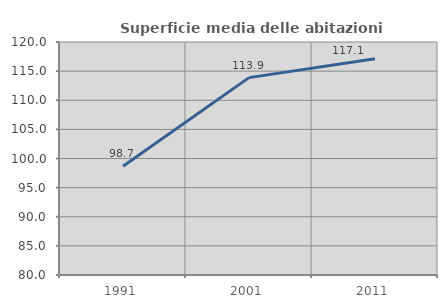
| Category | Superficie media delle abitazioni occupate |
|---|---|
| 1991.0 | 98.656 |
| 2001.0 | 113.882 |
| 2011.0 | 117.129 |